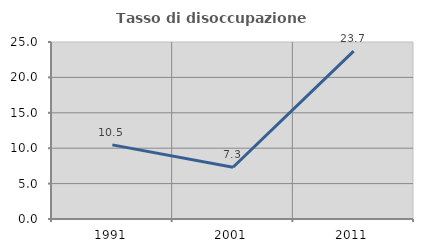
| Category | Tasso di disoccupazione giovanile  |
|---|---|
| 1991.0 | 10.472 |
| 2001.0 | 7.306 |
| 2011.0 | 23.715 |